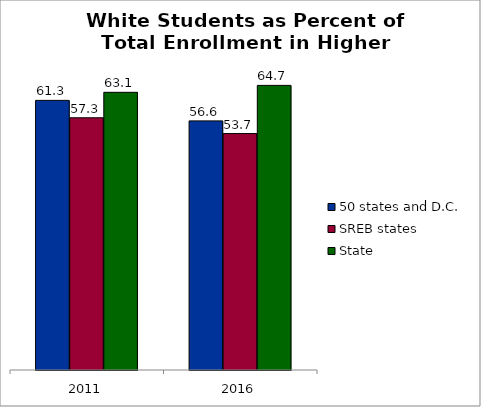
| Category | 50 states and D.C. | SREB states | State |
|---|---|---|---|
| 2011.0 | 61.278 | 57.323 | 63.109 |
| 2016.0 | 56.619 | 53.737 | 64.687 |